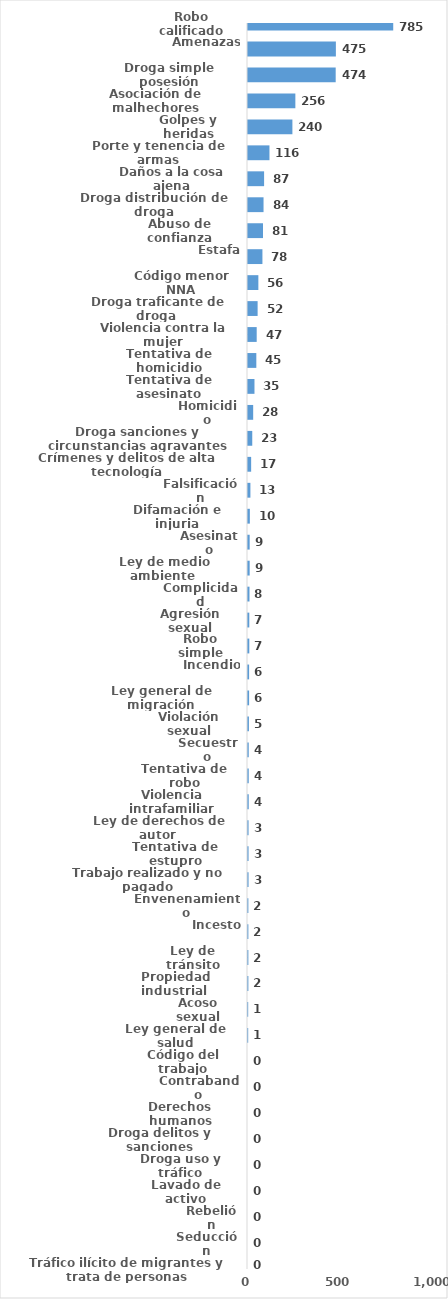
| Category | Series 0 |
|---|---|
| Robo calificado | 785 |
| Amenazas | 475 |
| Droga simple posesión | 474 |
| Asociación de malhechores | 256 |
| Golpes y heridas | 240 |
| Porte y tenencia de armas | 116 |
| Daños a la cosa ajena | 87 |
| Droga distribución de droga | 84 |
| Abuso de confianza | 81 |
| Estafa | 78 |
| Código menor NNA | 56 |
| Droga traficante de droga  | 52 |
| Violencia contra la mujer | 47 |
| Tentativa de homicidio | 45 |
| Tentativa de asesinato | 35 |
| Homicidio | 28 |
| Droga sanciones y circunstancias agravantes | 23 |
| Crímenes y delitos de alta tecnología | 17 |
| Falsificación | 13 |
| Difamación e injuria | 10 |
| Asesinato | 9 |
| Ley de medio ambiente  | 9 |
| Complicidad | 8 |
| Agresión sexual | 7 |
| Robo simple | 7 |
| Incendio | 6 |
| Ley general de migración | 6 |
| Violación sexual | 5 |
| Secuestro | 4 |
| Tentativa de robo | 4 |
| Violencia intrafamiliar | 4 |
| Ley de derechos de autor  | 3 |
| Tentativa de estupro | 3 |
| Trabajo realizado y no pagado | 3 |
| Envenenamiento | 2 |
| Incesto | 2 |
| Ley de tránsito | 2 |
| Propiedad industrial  | 2 |
| Acoso sexual | 1 |
| Ley general de salud | 1 |
| Código del trabajo | 0 |
| Contrabando | 0 |
| Derechos humanos | 0 |
| Droga delitos y sanciones | 0 |
| Droga uso y tráfico | 0 |
| Lavado de activo | 0 |
| Rebelión | 0 |
| Seducción | 0 |
| Tráfico ilícito de migrantes y trata de personas | 0 |